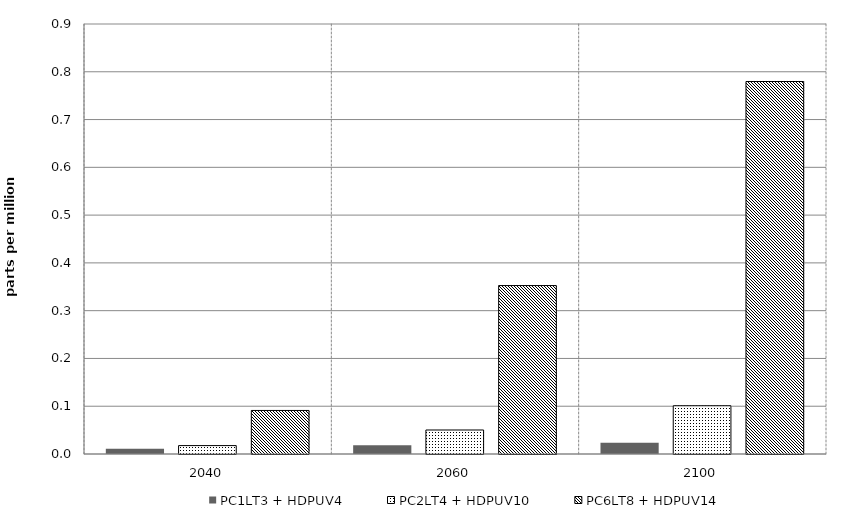
| Category | PC1LT3 + HDPUV4 | PC2LT4 + HDPUV10 | PC6LT8 + HDPUV14 | Alt 5 | Alt 6 | Alt 7 | Alt 8 | Alt 10 |
|---|---|---|---|---|---|---|---|---|
| 2040.0 | 0.011 | 0.018 | 0.091 |  |  |  |  |  |
| 2060.0 | 0.018 | 0.05 | 0.353 |  |  |  |  |  |
| 2100.0 | 0.023 | 0.101 | 0.78 |  |  |  |  |  |